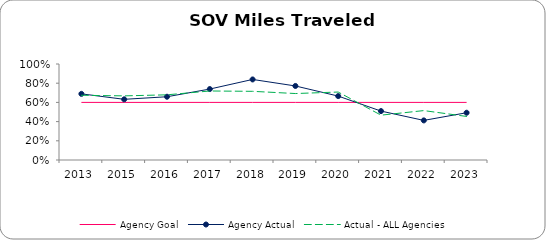
| Category | Agency Goal | Agency Actual | Actual - ALL Agencies |
|---|---|---|---|
| 2013.0 | 0.6 | 0.689 | 0.674 |
| 2015.0 | 0.6 | 0.632 | 0.668 |
| 2016.0 | 0.6 | 0.659 | 0.679 |
| 2017.0 | 0.6 | 0.739 | 0.719 |
| 2018.0 | 0.6 | 0.839 | 0.715 |
| 2019.0 | 0.6 | 0.771 | 0.692 |
| 2020.0 | 0.6 | 0.666 | 0.708 |
| 2021.0 | 0.6 | 0.509 | 0.467 |
| 2022.0 | 0.6 | 0.412 | 0.515 |
| 2023.0 | 0.6 | 0.492 | 0.454 |